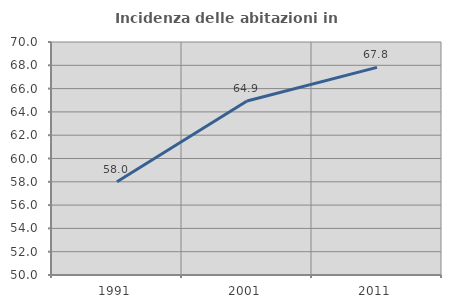
| Category | Incidenza delle abitazioni in proprietà  |
|---|---|
| 1991.0 | 58.008 |
| 2001.0 | 64.935 |
| 2011.0 | 67.821 |